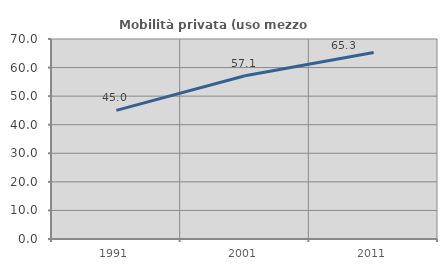
| Category | Mobilità privata (uso mezzo privato) |
|---|---|
| 1991.0 | 45.032 |
| 2001.0 | 57.119 |
| 2011.0 | 65.278 |